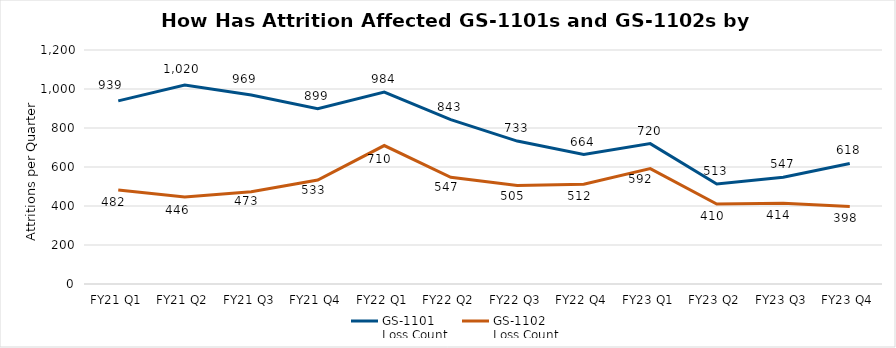
| Category | GS-1101 
Loss Count | GS-1102 
Loss Count |
|---|---|---|
| FY21 Q1 | 939 | 482 |
| FY21 Q2 | 1020 | 446 |
| FY21 Q3 | 969 | 473 |
| FY21 Q4 | 899 | 533 |
| FY22 Q1 | 984 | 710 |
| FY22 Q2 | 843 | 547 |
| FY22 Q3 | 733 | 505 |
| FY22 Q4 | 664 | 512 |
| FY23 Q1 | 720 | 592 |
| FY23 Q2 | 513 | 410 |
| FY23 Q3 | 547 | 414 |
| FY23 Q4 | 618 | 398 |